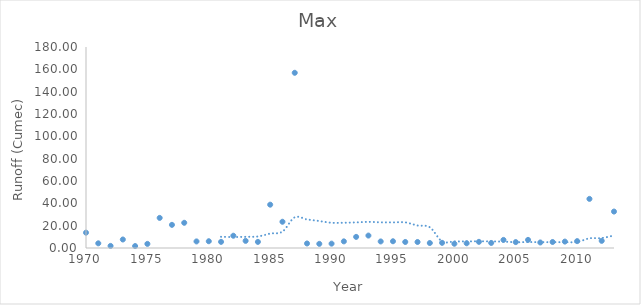
| Category | Max |
|---|---|
| 1970.0 | 13.735 |
| 1971.0 | 4.191 |
| 1972.0 | 1.869 |
| 1973.0 | 7.618 |
| 1974.0 | 1.756 |
| 1975.0 | 3.682 |
| 1976.0 | 26.961 |
| 1977.0 | 20.731 |
| 1978.0 | 22.572 |
| 1979.0 | 5.891 |
| 1980.0 | 6.061 |
| 1981.0 | 5.494 |
| 1982.0 | 10.988 |
| 1983.0 | 6.4 |
| 1984.0 | 5.466 |
| 1985.0 | 38.799 |
| 1986.0 | 23.506 |
| 1987.0 | 156.896 |
| 1988.0 | 4.05 |
| 1989.0 | 3.72 |
| 1990.0 | 3.9 |
| 1991.0 | 5.939 |
| 1992.0 | 9.956 |
| 1993.0 | 11.13 |
| 1994.0 | 5.864 |
| 1995.0 | 6.034 |
| 1996.0 | 5.405 |
| 1997.0 | 5.385 |
| 1998.0 | 4.465 |
| 1999.0 | 4.622 |
| 2000.0 | 3.812 |
| 2001.0 | 4.238 |
| 2002.0 | 5.508 |
| 2003.0 | 4.526 |
| 2004.0 | 7.245 |
| 2005.0 | 5.286 |
| 2006.0 | 7.263 |
| 2007.0 | 4.948 |
| 2008.0 | 5.382 |
| 2009.0 | 5.743 |
| 2010.0 | 6.159 |
| 2011.0 | 43.99 |
| 2012.0 | 6.41 |
| 2013.0 | 32.64 |